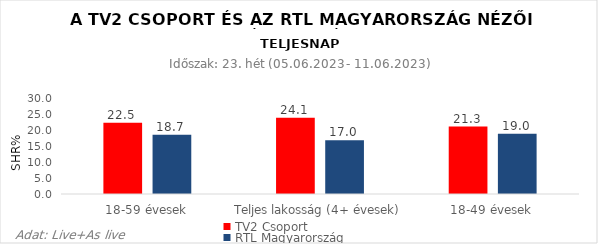
| Category | TV2 Csoport | RTL Magyarország |
|---|---|---|
| 18-59 évesek | 22.5 | 18.7 |
| Teljes lakosság (4+ évesek) | 24.1 | 17 |
| 18-49 évesek | 21.3 | 19 |